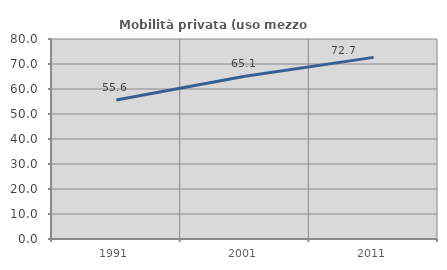
| Category | Mobilità privata (uso mezzo privato) |
|---|---|
| 1991.0 | 55.617 |
| 2001.0 | 65.114 |
| 2011.0 | 72.655 |